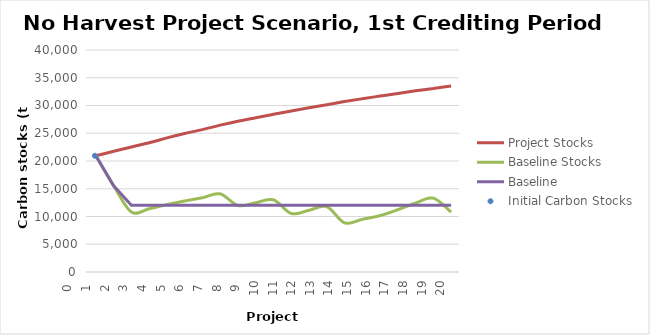
| Category | Project Stocks | Baseline Stocks | Baseline |
|---|---|---|---|
| 0.0 | 20939.76 | 20939.76 | 20939.76 |
| 1.0 | 21749.138 | 15536.826 | 15536.826 |
| 2.0 | 22533.966 | 10801.472 | 12023.933 |
| 3.0 | 23283.987 | 11392.475 | 12023.933 |
| 4.0 | 24161.515 | 12145.794 | 12023.933 |
| 5.0 | 24952.573 | 12795.421 | 12023.933 |
| 6.0 | 25654.962 | 13386.424 | 12023.933 |
| 7.0 | 26458.477 | 14081.851 | 12023.933 |
| 8.0 | 27168.926 | 11973.952 | 12023.933 |
| 9.0 | 27794.005 | 12481.416 | 12023.933 |
| 10.0 | 28409.557 | 12999.872 | 12023.933 |
| 11.0 | 29023.277 | 10535.466 | 12023.933 |
| 12.0 | 29603.458 | 11117.309 | 12023.933 |
| 13.0 | 30153.404 | 11771.333 | 12023.933 |
| 14.0 | 30713.242 | 8851.858 | 12023.933 |
| 15.0 | 31218.12 | 9496.722 | 12023.933 |
| 16.0 | 31697.716 | 10157.341 | 12023.933 |
| 17.0 | 32175.561 | 11228.328 | 12023.933 |
| 18.0 | 32646.125 | 12418.762 | 12023.933 |
| 19.0 | 33072.354 | 13305.083 | 12023.933 |
| 20.0 | 33512.874 | 10789.381 | 12023.933 |